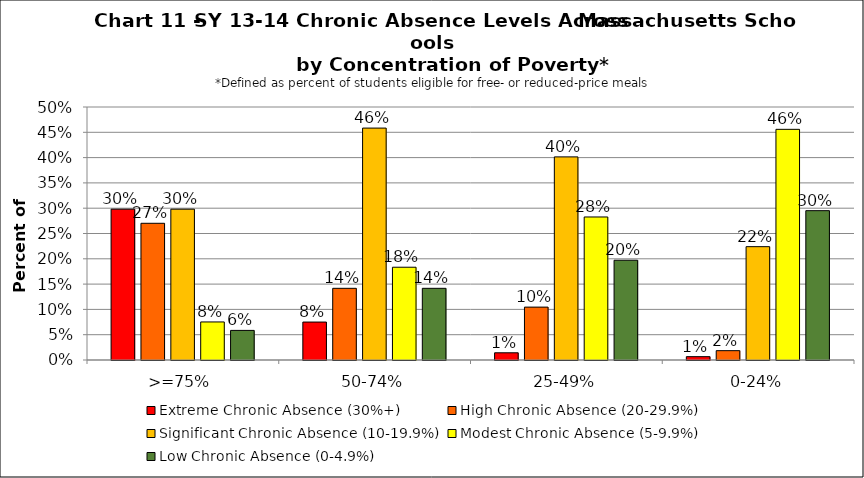
| Category | Extreme Chronic Absence (30%+) | High Chronic Absence (20-29.9%) | Significant Chronic Absence (10-19.9%) | Modest Chronic Absence (5-9.9%) | Low Chronic Absence (0-4.9%) |
|---|---|---|---|---|---|
| 0 | 0.298 | 0.27 | 0.298 | 0.075 | 0.058 |
| 1 | 0.075 | 0.142 | 0.458 | 0.183 | 0.142 |
| 2 | 0.014 | 0.105 | 0.401 | 0.283 | 0.197 |
| 3 | 0.007 | 0.018 | 0.224 | 0.456 | 0.295 |